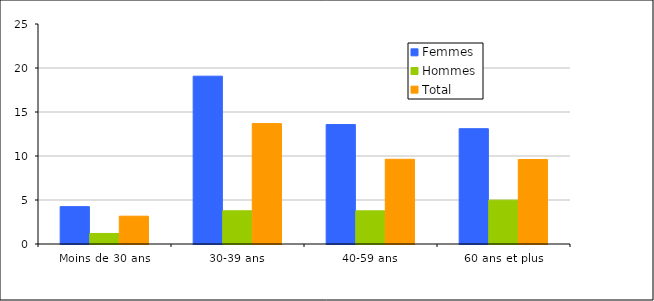
| Category | Femmes | Hommes | Total |
|---|---|---|---|
| Moins de 30 ans | 4.246 | 1.199 | 3.16 |
| 30-39 ans | 19.07 | 3.774 | 13.681 |
| 40-59 ans | 13.574 | 3.766 | 9.627 |
| 60 ans et plus | 13.102 | 4.983 | 9.604 |